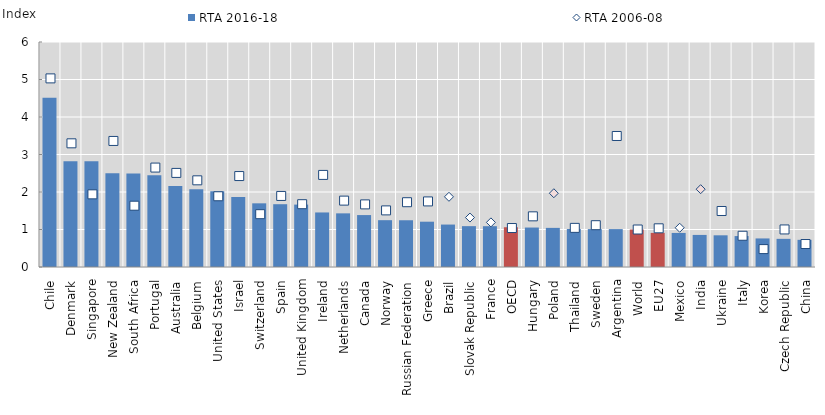
| Category | RTA 2016-18 |
|---|---|
| Chile | 4.512 |
| Denmark | 2.822 |
| Singapore | 2.821 |
| New Zealand | 2.502 |
| South Africa | 2.495 |
| Portugal | 2.447 |
| Australia | 2.163 |
| Belgium | 2.074 |
| United States | 2.022 |
| Israel | 1.868 |
| Switzerland | 1.698 |
| Spain | 1.674 |
| United Kingdom | 1.664 |
| Ireland | 1.455 |
| Netherlands | 1.431 |
| Canada | 1.385 |
| Norway | 1.249 |
| Russian Federation | 1.247 |
| Greece | 1.208 |
| Brazil | 1.132 |
| Slovak Republic | 1.089 |
| France | 1.088 |
| OECD | 1.06 |
| Hungary | 1.052 |
| Poland | 1.043 |
| Thailand | 1.013 |
| Sweden | 1.011 |
| Argentina | 1.011 |
| World | 1 |
| EU27 | 0.91 |
| Mexico | 0.908 |
| India | 0.855 |
| Ukraine | 0.845 |
| Italy | 0.825 |
| Korea | 0.762 |
| Czech Republic | 0.751 |
| China | 0.725 |